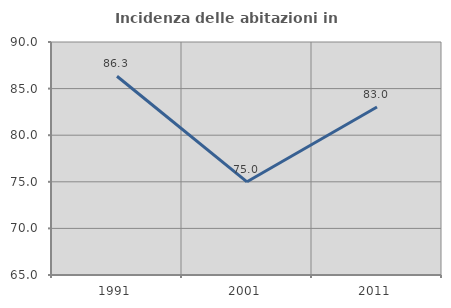
| Category | Incidenza delle abitazioni in proprietà  |
|---|---|
| 1991.0 | 86.325 |
| 2001.0 | 75 |
| 2011.0 | 83.019 |